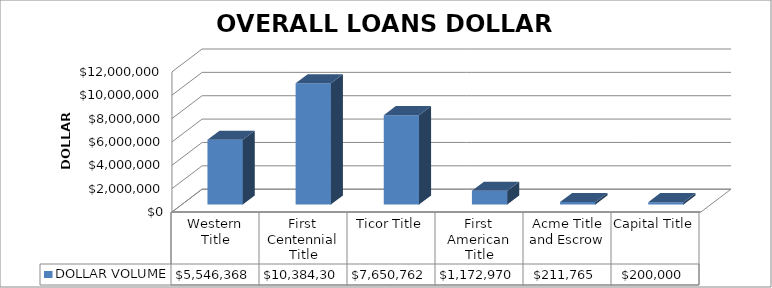
| Category | DOLLAR VOLUME |
|---|---|
| Western Title | 5546368 |
| First Centennial Title | 10384300 |
| Ticor Title | 7650762 |
| First American Title | 1172970 |
| Acme Title and Escrow | 211765 |
| Capital Title | 200000 |